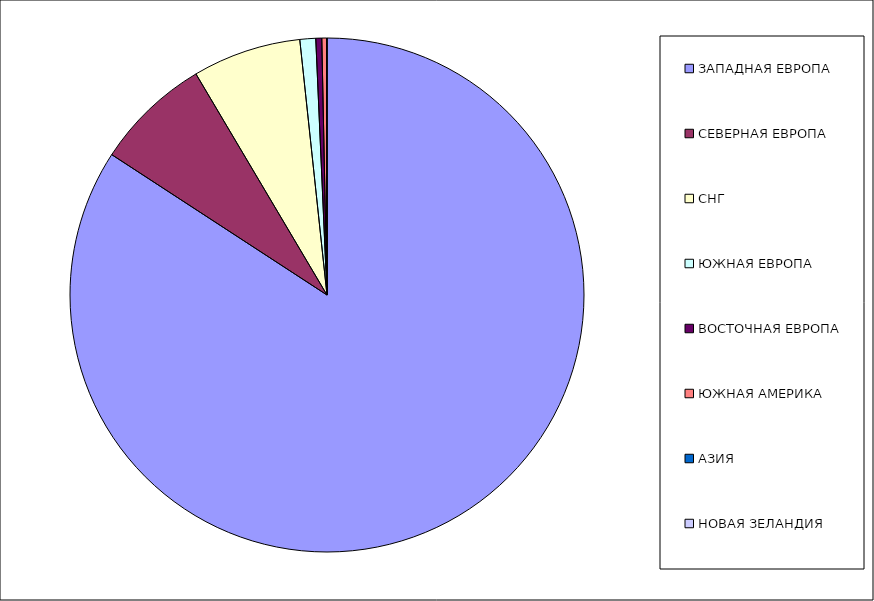
| Category | Оборот |
|---|---|
| ЗАПАДНАЯ ЕВРОПА | 0.842 |
| СЕВЕРНАЯ ЕВРОПА | 0.073 |
| СНГ | 0.068 |
| ЮЖНАЯ ЕВРОПА | 0.01 |
| ВОСТОЧНАЯ ЕВРОПА | 0.004 |
| ЮЖНАЯ АМЕРИКА | 0.003 |
| АЗИЯ | 0 |
| НОВАЯ ЗЕЛАНДИЯ | 0 |